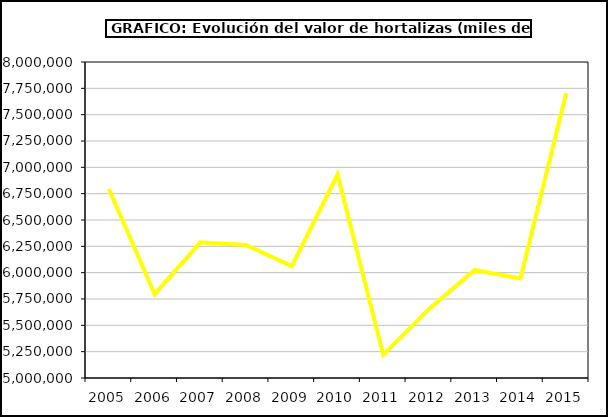
| Category | Valor |
|---|---|
| 2005.0 | 6794137.546 |
| 2006.0 | 5796221.037 |
| 2007.0 | 6287554.895 |
| 2008.0 | 6263457.851 |
| 2009.0 | 6061506.811 |
| 2010.0 | 6931312.064 |
| 2011.0 | 5220724.649 |
| 2012.0 | 5654821.085 |
| 2013.0 | 6025736 |
| 2014.0 | 5945397.615 |
| 2015.0 | 7705933 |